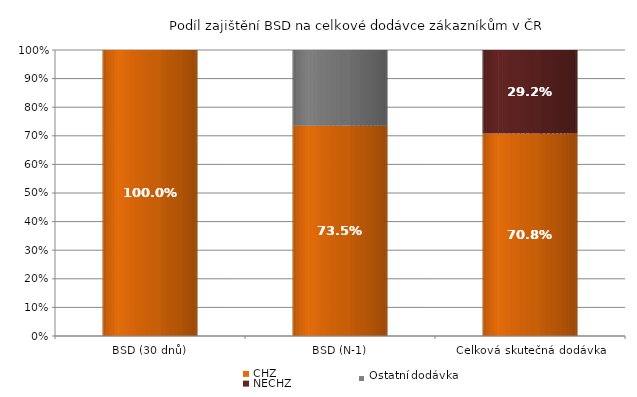
| Category | CHZ | NECHZ |
|---|---|---|
| BSD (30 dnů) | 1 | 0 |
| BSD (N-1) | 0.735 | 0.265 |
| Celková skutečná dodávka | 0.708 | 0.292 |